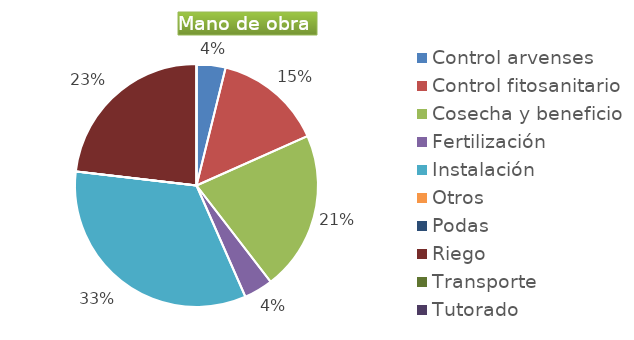
| Category | Series 0 |
|---|---|
| Control arvenses | 200000 |
| Control fitosanitario | 750000 |
| Cosecha y beneficio | 1100000 |
| Fertilización | 200000 |
| Instalación | 1733048 |
| Otros | 0 |
| Podas | 0 |
| Riego | 1200000 |
| Transporte | 0 |
| Tutorado | 0 |